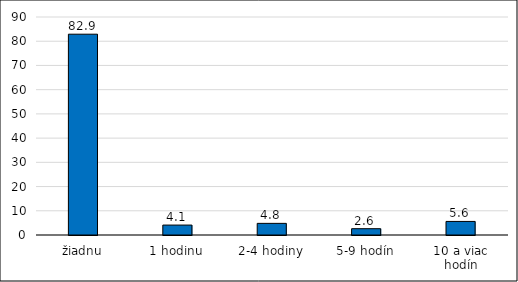
| Category | Series 0 |
|---|---|
| žiadnu | 82.9 |
| 1 hodinu | 4.1 |
| 2-4 hodiny | 4.8 |
| 5-9 hodín | 2.6 |
| 10 a viac hodín | 5.6 |